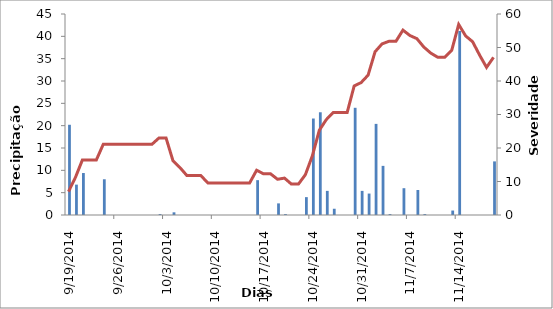
| Category | Precipitação |
|---|---|
| 9/19/14 | 20.2 |
| 9/20/14 | 6.8 |
| 9/21/14 | 9.4 |
| 9/22/14 | 0 |
| 9/23/14 | 0 |
| 9/24/14 | 8 |
| 9/25/14 | 0 |
| 9/26/14 | 0 |
| 9/27/14 | 0 |
| 9/28/14 | 0 |
| 9/29/14 | 0 |
| 9/30/14 | 0 |
| 10/1/14 | 0 |
| 10/2/14 | 0.2 |
| 10/3/14 | 0 |
| 10/4/14 | 0.6 |
| 10/5/14 | 0 |
| 10/6/14 | 0 |
| 10/7/14 | 0 |
| 10/8/14 | 0 |
| 10/9/14 | 0 |
| 10/10/14 | 0 |
| 10/11/14 | 0 |
| 10/12/14 | 0 |
| 10/13/14 | 0 |
| 10/14/14 | 0 |
| 10/15/14 | 0 |
| 10/16/14 | 7.8 |
| 10/17/14 | 0 |
| 10/18/14 | 0 |
| 10/19/14 | 2.6 |
| 10/20/14 | 0.2 |
| 10/21/14 | 0 |
| 10/22/14 | 0 |
| 10/23/14 | 4 |
| 10/24/14 | 21.6 |
| 10/25/14 | 23 |
| 10/26/14 | 5.4 |
| 10/27/14 | 1.4 |
| 10/28/14 | 0 |
| 10/29/14 | 0 |
| 10/30/14 | 24 |
| 10/31/14 | 5.4 |
| 11/1/14 | 4.8 |
| 11/2/14 | 20.4 |
| 11/3/14 | 11 |
| 11/4/14 | 0.2 |
| 11/5/14 | 0 |
| 11/6/14 | 6 |
| 11/7/14 | 0 |
| 11/8/14 | 5.6 |
| 11/9/14 | 0.2 |
| 11/10/14 | 0 |
| 11/11/14 | 0 |
| 11/12/14 | 0 |
| 11/13/14 | 1 |
| 11/14/14 | 41.2 |
| 11/15/14 | 0 |
| 11/16/14 | 0 |
| 11/17/14 | 0 |
| 11/18/14 | 0 |
| 11/19/14 | 12 |